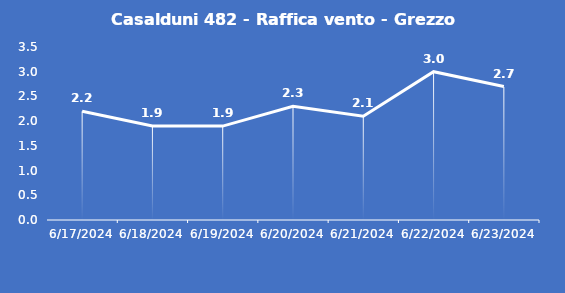
| Category | Casalduni 482 - Raffica vento - Grezzo (m/s) |
|---|---|
| 6/17/24 | 2.2 |
| 6/18/24 | 1.9 |
| 6/19/24 | 1.9 |
| 6/20/24 | 2.3 |
| 6/21/24 | 2.1 |
| 6/22/24 | 3 |
| 6/23/24 | 2.7 |